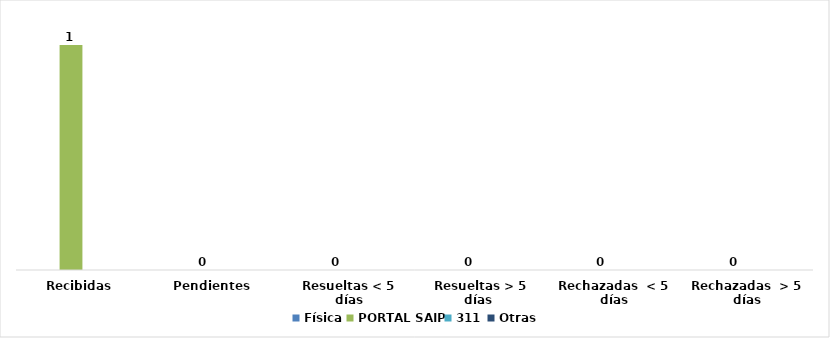
| Category | Física | PORTAL SAIP | 311 | Otras |
|---|---|---|---|---|
| Recibidas  | 0 | 1 | 0 | 0 |
| Pendientes  | 0 | 0 | 0 | 0 |
| Resueltas < 5 días | 0 | 0 | 0 | 0 |
| Resueltas > 5 días  | 0 | 0 | 0 | 0 |
| Rechazadas  < 5 días | 0 | 0 | 0 | 0 |
| Rechazadas  > 5 días | 0 | 0 | 0 | 0 |